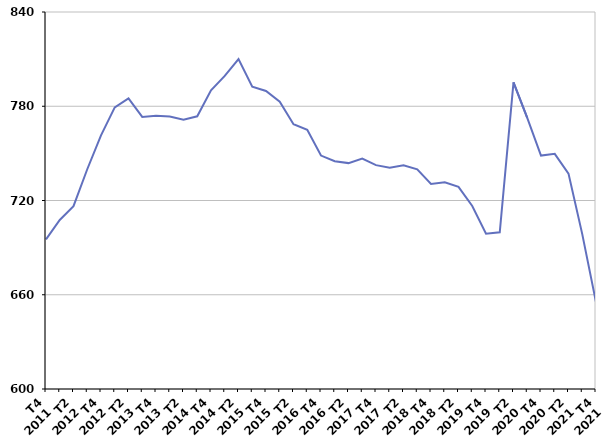
| Category | Moins de 25 ans |
|---|---|
| T4
2011 | 695.3 |
| T1
2012 | 707.6 |
| T2
2012 | 716.4 |
| T3
2012 | 739.9 |
| T4
2012 | 761.5 |
| T1
2013 | 779.3 |
| T2
2013 | 785 |
| T3
2013 | 773.2 |
| T4
2013 | 773.9 |
| T1
2014 | 773.4 |
| T2
2014 | 771.4 |
| T3
2014 | 773.6 |
| T4
2014 | 790.2 |
| T1
2015 | 799.3 |
| T2
2015 | 810 |
| T3
2015 | 792.5 |
| T4
2015 | 789.7 |
| T1
2016 | 782.9 |
| T2
2016 | 768.6 |
| T3
2016 | 765 |
| T4
2016 | 748.6 |
| T1
2017 | 745 |
| T2
2017 | 743.8 |
| T3
2017 | 746.7 |
| T4
2017 | 742.5 |
| T1
2018 | 740.9 |
| T2
2018 | 742.4 |
| T3
2018 | 739.8 |
| T4
2018 | 730.5 |
| T1
2019 | 731.6 |
| T2
2019 | 728.7 |
| T3
2019 | 716.5 |
| T4
2019 | 698.8 |
| T1
2020 | 699.8 |
| T2
2020 | 795.2 |
| T3
2020 | 772.6 |
| T4
2020 | 748.6 |
| T1
2021 | 749.7 |
| T2
2021 | 737.1 |
| T3
2021 | 698.6 |
| T4
2021 | 655.3 |